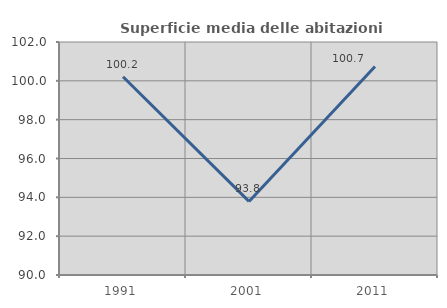
| Category | Superficie media delle abitazioni occupate |
|---|---|
| 1991.0 | 100.212 |
| 2001.0 | 93.79 |
| 2011.0 | 100.737 |